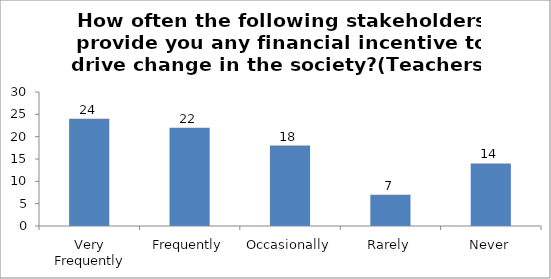
| Category | How often the following stakeholders provide you any financial incentive to drive change in the society?(Teachers) |
|---|---|
| Very Frequently | 24 |
| Frequently | 22 |
| Occasionally | 18 |
| Rarely | 7 |
| Never | 14 |